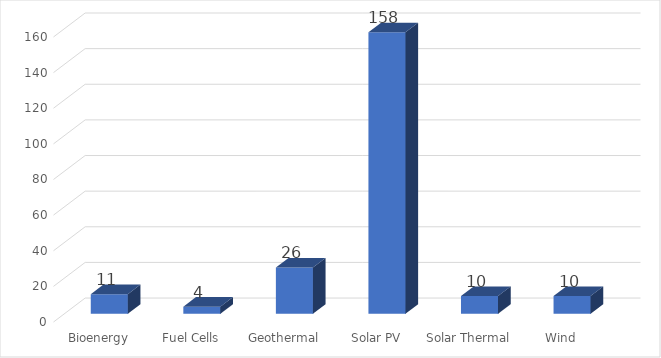
| Category | Series 0 |
|---|---|
| Bioenergy | 11 |
| Fuel Cells | 4 |
| Geothermal | 26 |
| Solar PV | 158 |
| Solar Thermal | 10 |
| Wind | 10 |